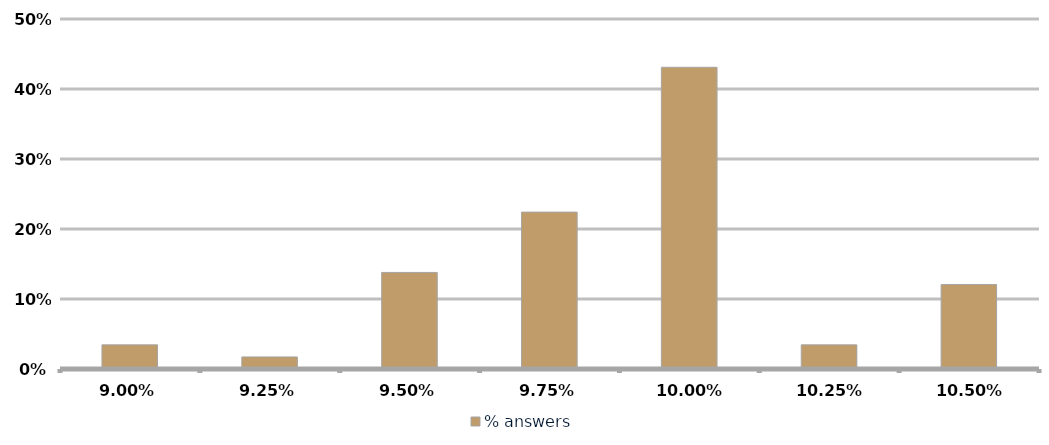
| Category | % answers |
|---|---|
| 0.09 | 0.034 |
| 0.0925 | 0.017 |
| 0.095 | 0.138 |
| 0.0975 | 0.224 |
| 0.1 | 0.431 |
| 0.10250000000000001 | 0.034 |
| 0.10500000000000001 | 0.121 |